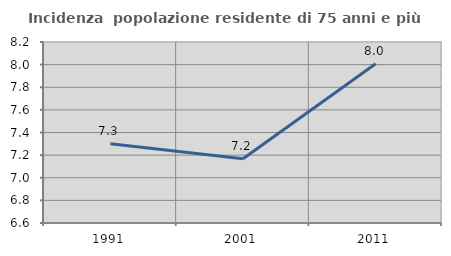
| Category | Incidenza  popolazione residente di 75 anni e più |
|---|---|
| 1991.0 | 7.301 |
| 2001.0 | 7.168 |
| 2011.0 | 8.008 |